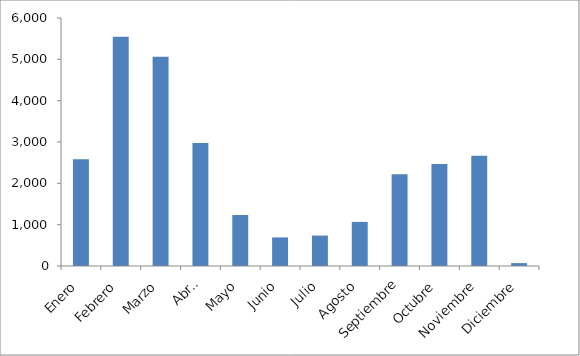
| Category | Series 0 |
|---|---|
| Enero | 2583 |
| Febrero | 5547 |
| Marzo | 5062 |
| Abril | 2976 |
| Mayo | 1233 |
| Junio | 692 |
| Julio | 736 |
| Agosto | 1067 |
| Septiembre | 2222 |
| Octubre | 2469 |
| Noviembre | 2670 |
| Diciembre | 70 |